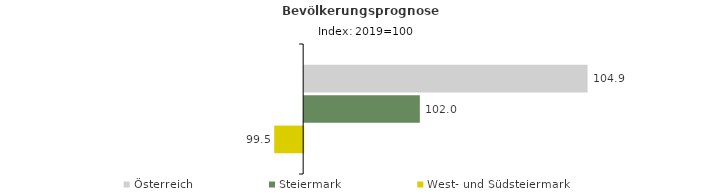
| Category | Österreich | Steiermark | West- und Südsteiermark |
|---|---|---|---|
| 2019.0 | 104.9 | 102 | 99.5 |